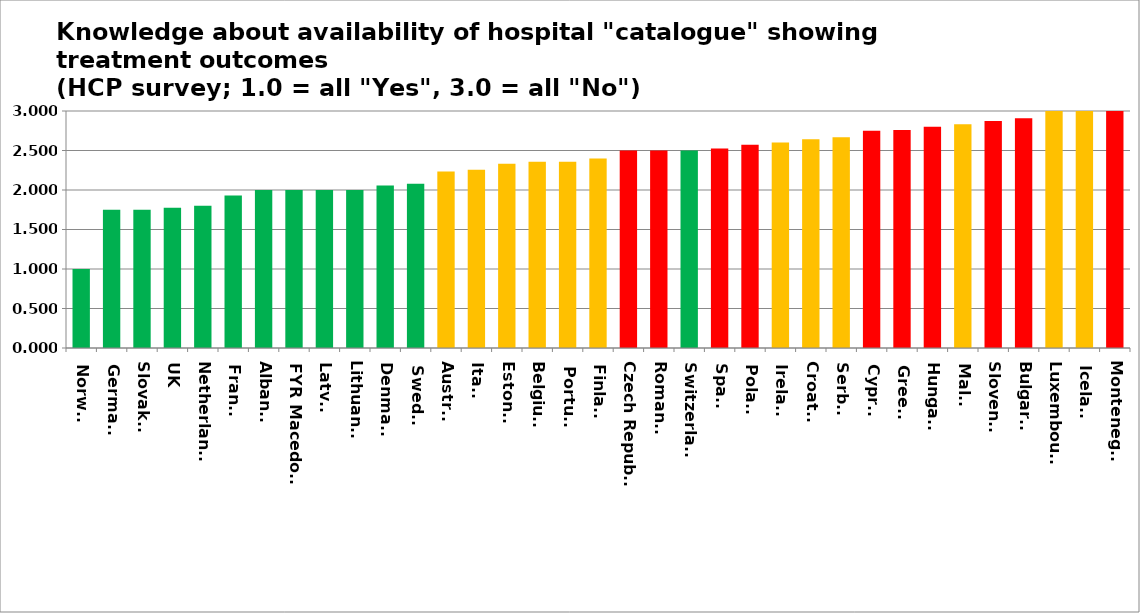
| Category | Series 0 |
|---|---|
| Norway | 1 |
| Germany | 1.75 |
| Slovakia | 1.75 |
| UK | 1.775 |
| Netherlands | 1.8 |
| France | 1.931 |
| Albania | 2 |
| FYR Macedonia | 2 |
| Latvia | 2 |
| Lithuania | 2 |
| Denmark | 2.056 |
| Sweden | 2.08 |
| Austria | 2.235 |
| Italy | 2.257 |
| Estonia | 2.333 |
| Belgium | 2.357 |
| Portugal | 2.357 |
| Finland | 2.4 |
| Czech Republic | 2.5 |
| Romania | 2.5 |
| Switzerland | 2.5 |
| Spain | 2.524 |
| Poland | 2.571 |
| Ireland | 2.6 |
| Croatia | 2.643 |
| Serbia | 2.667 |
| Cyprus | 2.75 |
| Greece | 2.76 |
| Hungary | 2.8 |
| Malta | 2.833 |
| Slovenia | 2.875 |
| Bulgaria | 2.909 |
| Luxembourg | 3 |
| Iceland | 3 |
| Montenegro | 3 |